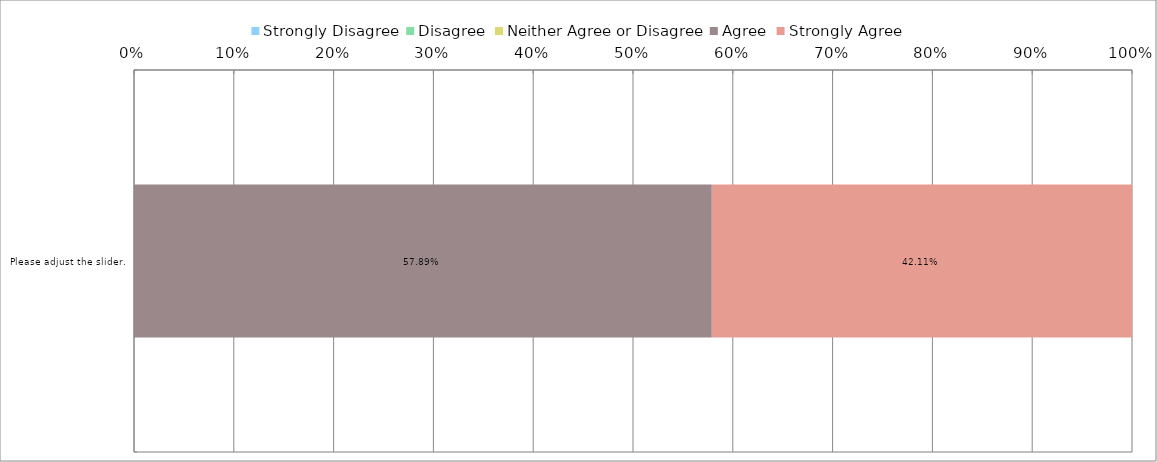
| Category | Strongly Disagree | Disagree | Neither Agree or Disagree | Agree | Strongly Agree |
|---|---|---|---|---|---|
| 0 | 0 | 0 | 0 | 0.579 | 0.421 |